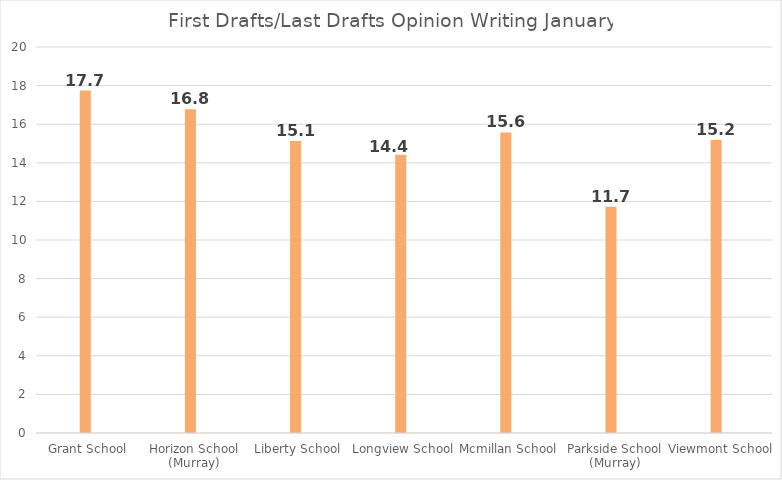
| Category | Series 0 | Series 1 | Series 2 | Series 3 | Series 4 | Series 5 | Jan | Series 7 | LAST | Series 9 | Series 10 | Series 11 | Series 12 | Series 13 |
|---|---|---|---|---|---|---|---|---|---|---|---|---|---|---|
| Grant School |  |  |  |  |  |  | 17.744 |  |  |  |  |  |  |  |
| Horizon School (Murray) |  |  |  |  |  |  | 16.77 |  |  |  |  |  |  |  |
| Liberty School |  |  |  |  |  |  | 15.126 |  |  |  |  |  |  |  |
| Longview School |  |  |  |  |  |  | 14.421 |  |  |  |  |  |  |  |
| Mcmillan School |  |  |  |  |  |  | 15.574 |  |  |  |  |  |  |  |
| Parkside School (Murray) |  |  |  |  |  |  | 11.727 |  |  |  |  |  |  |  |
| Viewmont School |  |  |  |  |  |  | 15.179 |  |  |  |  |  |  |  |